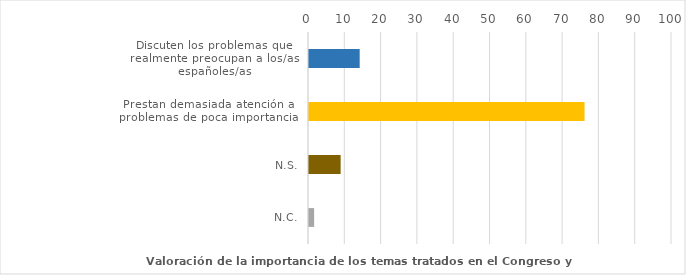
| Category | Series 0 |
|---|---|
| Discuten los problemas que realmente preocupan a los/as españoles/as | 13.964 |
| Prestan demasiada atención a problemas de poca importancia | 75.908 |
| N.S. | 8.715 |
| N.C. | 1.413 |